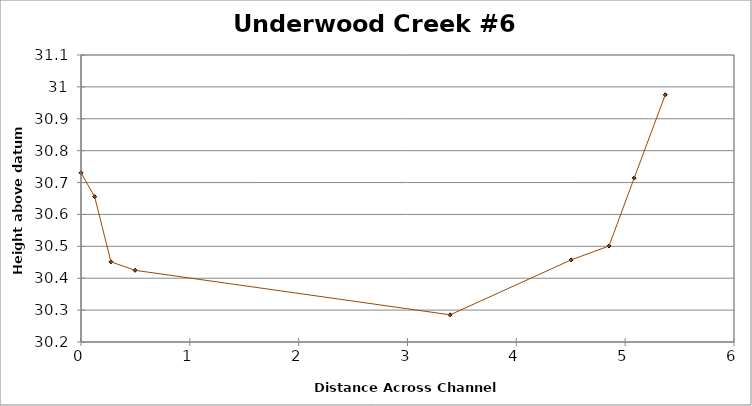
| Category | Series 0 |
|---|---|
| 0.0 | 30.731 |
| 0.1254776864661748 | 30.656 |
| 0.2751864649286855 | 30.451 |
| 0.49711749367880526 | 30.425 |
| 3.3920109064928674 | 30.285 |
| 4.503698901414378 | 30.457 |
| 4.851631440343156 | 30.501 |
| 5.082670664755193 | 30.714 |
| 5.368616152050975 | 30.975 |